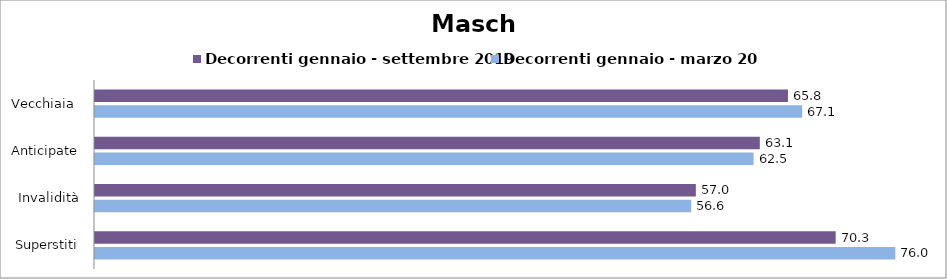
| Category | Decorrenti gennaio - settembre 2019 | Decorrenti gennaio - marzo 2021 |
|---|---|---|
| Vecchiaia  | 65.76 | 67.11 |
| Anticipate | 63.09 | 62.5 |
| Invalidità | 57.02 | 56.58 |
| Superstiti | 70.29 | 75.95 |